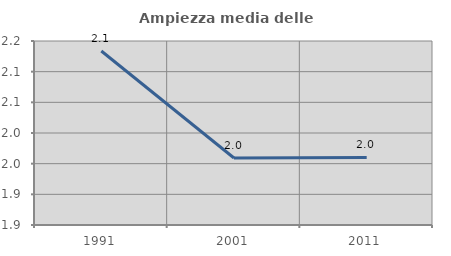
| Category | Ampiezza media delle famiglie |
|---|---|
| 1991.0 | 2.134 |
| 2001.0 | 1.959 |
| 2011.0 | 1.96 |